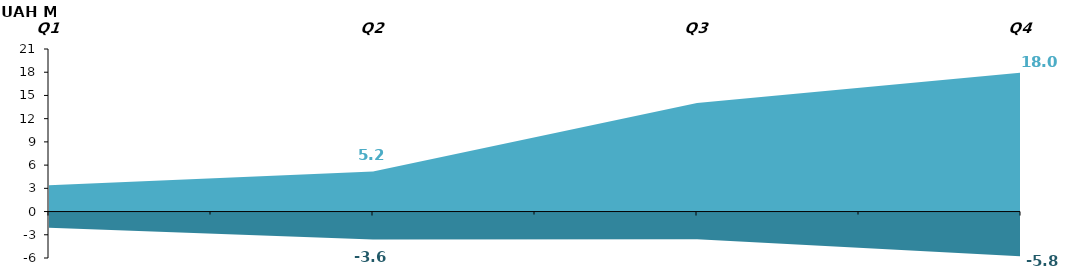
| Category | 2019 | 2020 |
|---|---|---|
| Q1 | -2.08 | 3.4 |
| Q2 | -3.62 | 5.18 |
| Q3 | -3.57 | 14.03 |
| Q4 | -5.79 | 17.96 |